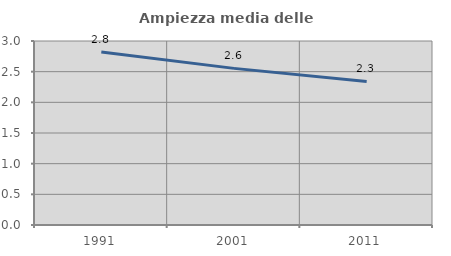
| Category | Ampiezza media delle famiglie |
|---|---|
| 1991.0 | 2.82 |
| 2001.0 | 2.554 |
| 2011.0 | 2.341 |